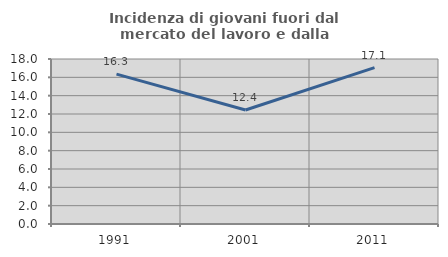
| Category | Incidenza di giovani fuori dal mercato del lavoro e dalla formazione  |
|---|---|
| 1991.0 | 16.344 |
| 2001.0 | 12.441 |
| 2011.0 | 17.052 |